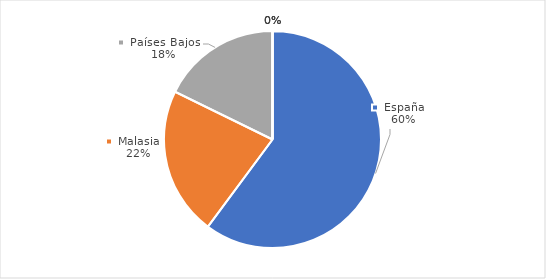
| Category | Series 0 |
|---|---|
| España | 418.721 |
| Malasia | 153.944 |
| Países Bajos | 123.57 |